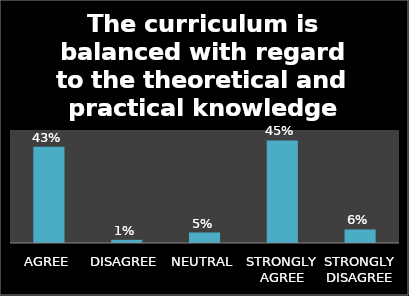
| Category | Series 0 |
|---|---|
| AGREE | 0.426 |
| DISAGREE | 0.014 |
| NEUTRAL | 0.046 |
| STRONGLY AGREE | 0.454 |
| STRONGLY DISAGREE | 0.06 |